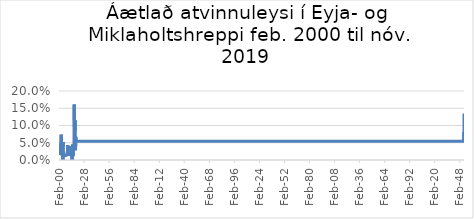
| Category | Series 0 |
|---|---|
| 2000-02-01 | 0.016 |
| 2000-03-01 | 0.016 |
| 2000-04-01 | 0.016 |
| 2000-05-01 | 0.016 |
| 2000-06-01 | 0.033 |
| 2000-07-01 | 0.029 |
| 2000-08-01 | 0.015 |
| 2000-09-01 | 0.015 |
| 2000-10-01 | 0.015 |
| 2000-11-01 | 0.015 |
| 2000-12-01 | 0.015 |
| 2001-01-01 | 0.015 |
| 2001-02-01 | 0.015 |
| 2001-03-01 | 0.015 |
| 2001-04-01 | 0.015 |
| 2001-05-01 | 0.015 |
| 2001-06-01 | 0.015 |
| 2001-07-01 | 0.029 |
| 2001-08-01 | 0.014 |
| 2001-09-01 | 0.014 |
| 2001-10-01 | 0.029 |
| 2001-11-01 | 0.029 |
| 2001-12-01 | 0.029 |
| 2002-01-01 | 0.044 |
| 2002-02-01 | 0.044 |
| 2002-03-01 | 0.044 |
| 2002-04-01 | 0.044 |
| 2002-05-01 | 0.029 |
| 2002-06-01 | 0.015 |
| 2002-07-01 | 0.074 |
| 2002-08-01 | 0.029 |
| 2002-09-01 | 0.029 |
| 2002-10-01 | 0.029 |
| 2002-11-01 | 0.044 |
| 2002-12-01 | 0.059 |
| 2003-01-01 | 0.061 |
| 2003-02-01 | 0.045 |
| 2003-03-01 | 0.045 |
| 2003-04-01 | 0.044 |
| 2003-05-01 | 0.044 |
| 2003-06-01 | 0.015 |
| 2003-07-01 | 0.039 |
| 2003-08-01 | 0.013 |
| 2003-09-01 | 0.013 |
| 2003-10-01 | 0.014 |
| 2003-11-01 | 0.027 |
| 2003-12-01 | 0.027 |
| 2004-01-01 | 0.028 |
| 2004-02-01 | 0.028 |
| 2004-03-01 | 0.028 |
| 2004-04-01 | 0.027 |
| 2004-05-01 | 0.027 |
| 2004-06-01 | 0 |
| 2004-07-01 | 0.013 |
| 2004-08-01 | 0.013 |
| 2004-09-01 | 0.013 |
| 2004-10-01 | 0.052 |
| 2004-11-01 | 0.039 |
| 2004-12-01 | 0.026 |
| 2005-01-01 | 0.026 |
| 2005-02-01 | 0.026 |
| 2005-03-01 | 0.026 |
| 2005-04-01 | 0.026 |
| 2005-05-01 | 0.026 |
| 2005-06-01 | 0.013 |
| 2005-07-01 | 0.012 |
| 2005-08-01 | 0.012 |
| 2005-09-01 | 0.012 |
| 2005-10-01 | 0.013 |
| 2005-11-01 | 0.013 |
| 2006-09-01 | 0.012 |
| 2006-10-01 | 0.013 |
| 2006-11-01 | 0.013 |
| 2006-12-01 | 0.013 |
| 2007-01-01 | 0.013 |
| 2007-02-01 | 0.013 |
| 2007-03-01 | 0.013 |
| 2007-04-01 | 0.012 |
| 2007-05-01 | 0.012 |
| 2008-08-01 | 0.014 |
| 2008-09-01 | 0.014 |
| 2009-06-01 | 0.014 |
| 2009-07-01 | 0.014 |
| 2009-08-01 | 0.014 |
| 2009-09-01 | 0.028 |
| 2009-10-01 | 0.043 |
| 2009-11-01 | 0.043 |
| 2009-12-01 | 0.043 |
| 2010-01-01 | 0.043 |
| 2010-02-01 | 0.043 |
| 2010-03-01 | 0.029 |
| 2010-04-01 | 0.028 |
| 2010-05-01 | 0.028 |
| 2010-06-01 | 0.028 |
| 2010-07-01 | 0.025 |
| 2010-08-01 | 0.025 |
| 2010-09-01 | 0.038 |
| 2010-10-01 | 0.026 |
| 2010-11-01 | 0.026 |
| 2010-12-01 | 0.026 |
| 2011-01-01 | 0.026 |
| 2011-02-01 | 0.013 |
| 2011-03-01 | 0.013 |
| 2011-04-01 | 0.013 |
| 2011-05-01 | 0.026 |
| 2011-06-01 | 0.026 |
| 2011-07-01 | 0.025 |
| 2011-08-01 | 0.013 |
| 2011-09-01 | 0.013 |
| 2011-10-01 | 0.013 |
| 2011-11-01 | 0.013 |
| 2011-12-01 | 0.013 |
| 2012-01-01 | 0.013 |
| 2012-02-01 | 0.026 |
| 2012-03-01 | 0.026 |
| 2012-04-01 | 0.025 |
| 2012-05-01 | 0.012 |
| 2012-06-01 | 0.012 |
| 2012-07-01 | 0.013 |
| 2012-08-01 | 0.013 |
| 2012-09-01 | 0.013 |
| 2012-10-01 | 0.026 |
| 2012-11-01 | 0.026 |
| 2012-12-01 | 0.039 |
| 2013-01-01 | 0.026 |
| 2013-02-01 | 0.026 |
| 2013-03-01 | 0.026 |
| 2013-04-01 | 0.012 |
| 2013-05-01 | 0.012 |
| 2013-06-01 | 0.012 |
| 2013-07-01 | 0.01 |
| 2013-08-01 | 0.01 |
| 2013-09-01 | 0.01 |
| 2013-10-01 | 0.011 |
| 2013-11-01 | 0.011 |
| 2013-12-01 | 0.011 |
| 2014-01-01 | 0.011 |
| 2014-02-01 | 0.011 |
| 2014-03-01 | 0.011 |
| 2014-04-01 | 0.01 |
| 2014-05-01 | 0.01 |
| 2014-06-01 | 0.021 |
| 2014-07-01 | 0.023 |
| 2014-08-01 | 0.011 |
| 2014-09-01 | 0.023 |
| 2014-10-01 | 0 |
| 2014-11-01 | 0.012 |
| 2014-12-01 | 0.012 |
| 2015-01-01 | 0.023 |
| 2015-02-01 | 0.023 |
| 2015-03-01 | 0.034 |
| 2015-04-01 | 0.045 |
| 2015-05-01 | 0.022 |
| 2015-06-01 | 0.011 |
| 2015-07-01 | 0.023 |
| 2015-08-01 | 0.011 |
| 2015-09-01 | 0.011 |
| 2015-10-01 | 0.012 |
| 2015-11-01 | 0.012 |
| 2015-12-01 | 0.012 |
| 2016-01-01 | 0.011 |
| 2016-02-01 | 0.011 |
| 2016-03-01 | 0.023 |
| 2016-04-01 | 0.023 |
| 2016-05-01 | 0.023 |
| 2016-06-01 | 0.023 |
| 2016-07-01 | 0.023 |
| 2016-08-01 | 0.023 |
| 2016-09-01 | 0.023 |
| 2016-10-01 | 0.023 |
| 2016-11-01 | 0.046 |
| 2016-12-01 | 0.08 |
| 2017-01-01 | 0.161 |
| 2017-02-01 | 0.115 |
| 2017-03-01 | 0.103 |
| 2017-04-01 | 0.103 |
| 2017-05-01 | 0.092 |
| 2017-06-01 | 0.057 |
| 2017-07-01 | 0.056 |
| 2017-08-01 | 0.056 |
| 2017-09-01 | 0.042 |
| 2017-10-01 | 0.056 |
| 2017-11-01 | 0.085 |
| 2017-12-01 | 0.085 |
| 2018-01-01 | 0.1 |
| 2018-02-01 | 0.1 |
| 2018-03-01 | 0.114 |
| 2018-04-01 | 0.085 |
| 2018-05-01 | 0.085 |
| 2018-06-01 | 0.028 |
| 2018-07-01 | 0.039 |
| 2018-08-01 | 0.053 |
| 2018-09-01 | 0.039 |
| 2018-10-01 | 0.041 |
| 2018-11-01 | 0.054 |
| 2018-12-01 | 0.068 |
| 2019-01-01 | 0.068 |
| 2019-02-01 | 0.054 |
| 2019-03-01 | 0.054 |
| 2019-04-01 | 0.054 |
| 201905.0 | 0.054 |
| 201906.0 | 0.081 |
| 201907.0 | 0.068 |
| 201908.0 | 0.054 |
| 201909.0 | 0.068 |
| 201910.0 | 0.095 |
| 201911.0 | 0.135 |